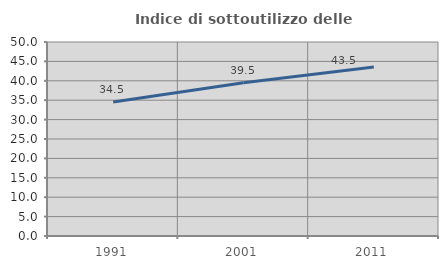
| Category | Indice di sottoutilizzo delle abitazioni  |
|---|---|
| 1991.0 | 34.538 |
| 2001.0 | 39.51 |
| 2011.0 | 43.541 |